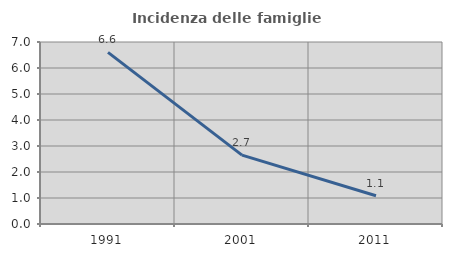
| Category | Incidenza delle famiglie numerose |
|---|---|
| 1991.0 | 6.601 |
| 2001.0 | 2.65 |
| 2011.0 | 1.087 |